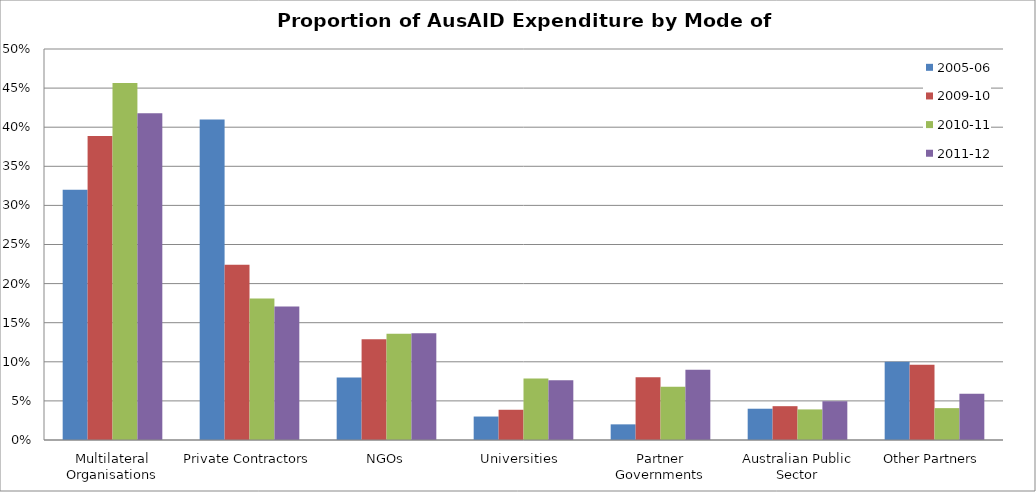
| Category | 2005-06 | 2009-10 | 2010-11 | 2011-12 |
|---|---|---|---|---|
| Multilateral Organisations | 0.32 | 0.389 | 0.457 | 0.418 |
| Private Contractors | 0.41 | 0.224 | 0.181 | 0.171 |
| NGOs | 0.08 | 0.129 | 0.136 | 0.137 |
| Universities  | 0.03 | 0.039 | 0.079 | 0.077 |
| Partner Governments | 0.02 | 0.08 | 0.068 | 0.09 |
| Australian Public Sector | 0.04 | 0.043 | 0.039 | 0.049 |
| Other Partners | 0.1 | 0.096 | 0.041 | 0.059 |